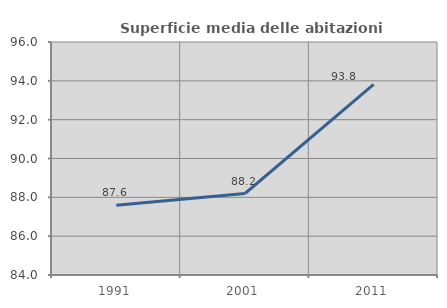
| Category | Superficie media delle abitazioni occupate |
|---|---|
| 1991.0 | 87.593 |
| 2001.0 | 88.197 |
| 2011.0 | 93.817 |